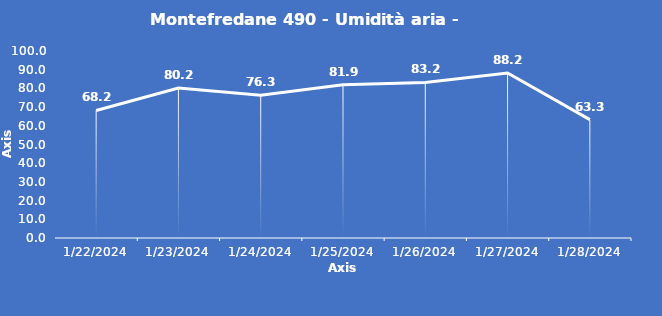
| Category | Montefredane 490 - Umidità aria - Grezzo (%) |
|---|---|
| 1/22/24 | 68.2 |
| 1/23/24 | 80.2 |
| 1/24/24 | 76.3 |
| 1/25/24 | 81.9 |
| 1/26/24 | 83.2 |
| 1/27/24 | 88.2 |
| 1/28/24 | 63.3 |